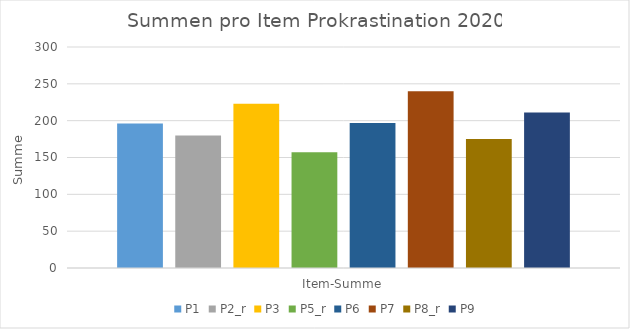
| Category | P1 | P2_r | P3 | P5_r | P6 | P7 | P8_r | P9 |
|---|---|---|---|---|---|---|---|---|
| Item-Summe | 196 | 180 | 223 | 157 | 197 | 240 | 175 | 211 |